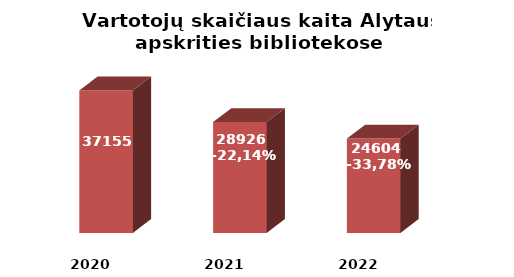
| Category | Series 0 |
|---|---|
| 2020.0 | 37155 |
| 2021.0 | 28926 |
| 2022.0 | 24604 |